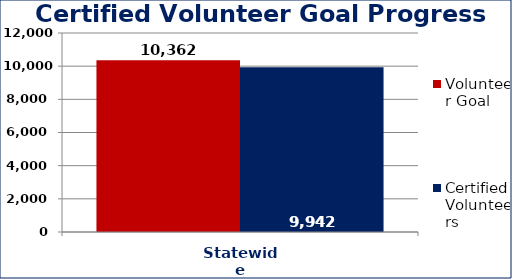
| Category | Volunteer Goal  | Certified Volunteers  |
|---|---|---|
| Statewide | 10362 | 9942 |